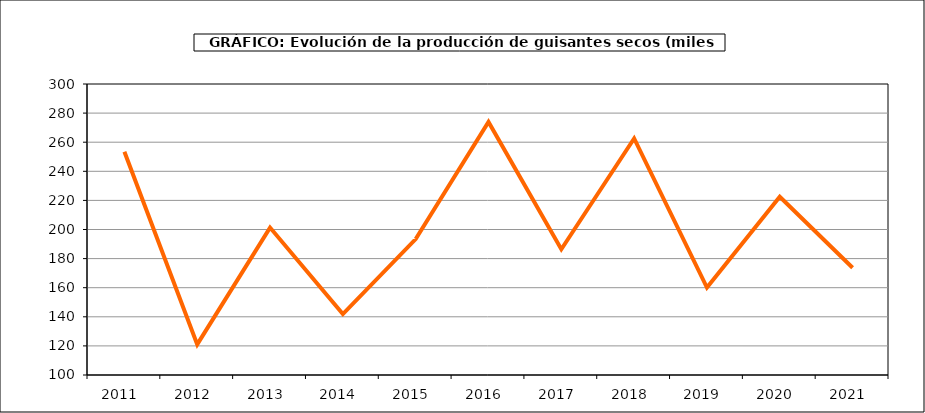
| Category | Producción |
|---|---|
| 2011.0 | 253.427 |
| 2012.0 | 121.017 |
| 2013.0 | 201.326 |
| 2014.0 | 141.855 |
| 2015.0 | 193.389 |
| 2016.0 | 273.954 |
| 2017.0 | 186.406 |
| 2018.0 | 262.567 |
| 2019.0 | 160.115 |
| 2020.0 | 222.459 |
| 2021.0 | 173.751 |